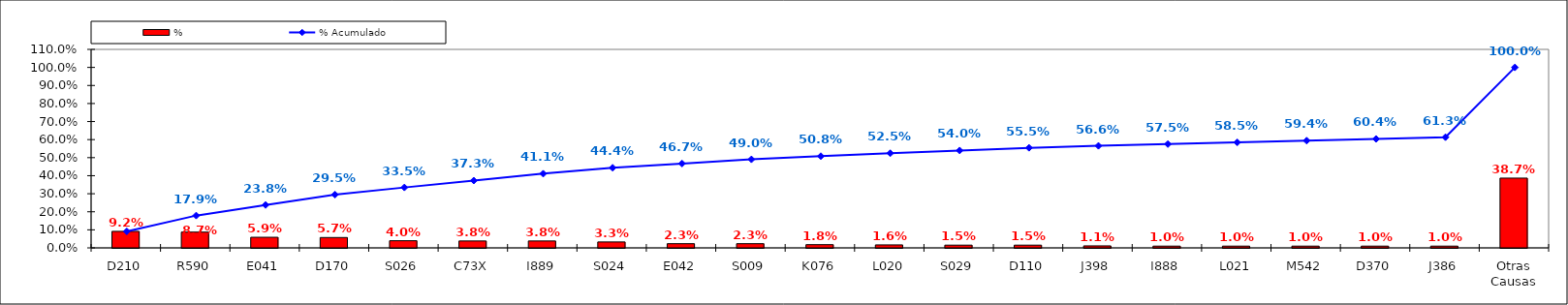
| Category | % |
|---|---|
| D210 | 0.092 |
| R590 | 0.087 |
| E041 | 0.059 |
| D170 | 0.057 |
| S026 | 0.04 |
| C73X | 0.038 |
| I889 | 0.038 |
| S024 | 0.033 |
| E042 | 0.023 |
| S009 | 0.023 |
| K076 | 0.018 |
| L020 | 0.016 |
| S029 | 0.015 |
| D110 | 0.015 |
| J398 | 0.011 |
| I888 | 0.01 |
| L021 | 0.01 |
| M542 | 0.01 |
| D370 | 0.01 |
| J386 | 0.01 |
| Otras Causas | 0.387 |